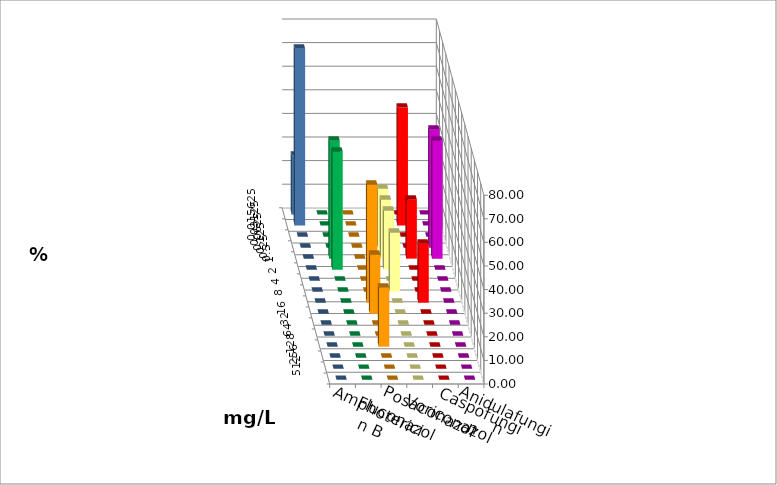
| Category | Amphotericin B | Fluconazol | Posaconazol | Voriconazol | Caspofungin | Anidulafungin |
|---|---|---|---|---|---|---|
| 0.015625 | 0 | 0 | 0 | 0 | 0 | 25 |
| 0.03125 | 0 | 0 | 0 | 50 | 0 | 75 |
| 0.0625 | 0 | 0 | 0 | 0 | 0 | 0 |
| 0.125 | 0 | 0 | 25 | 0 | 50 | 0 |
| 0.25 | 50 | 0 | 25 | 25 | 50 | 0 |
| 0.5 | 50 | 0 | 25 | 0 | 0 | 0 |
| 1.0 | 0 | 0 | 0 | 0 | 0 | 0 |
| 2.0 | 0 | 0 | 25 | 0 | 0 | 0 |
| 4.0 | 0 | 50 | 0 | 25 | 0 | 0 |
| 8.0 | 0 | 25 | 0 | 0 | 0 | 0 |
| 16.0 | 0 | 0 | 0 | 0 | 0 | 0 |
| 32.0 | 0 | 0 | 0 | 0 | 0 | 0 |
| 64.0 | 0 | 25 | 0 | 0 | 0 | 0 |
| 128.0 | 0 | 0 | 0 | 0 | 0 | 0 |
| 256.0 | 0 | 0 | 0 | 0 | 0 | 0 |
| 512.0 | 0 | 0 | 0 | 0 | 0 | 0 |